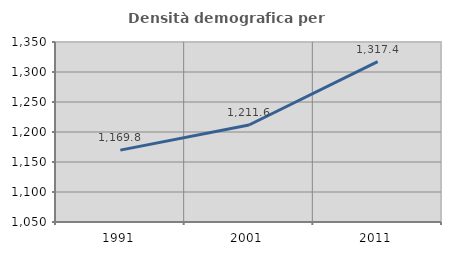
| Category | Densità demografica |
|---|---|
| 1991.0 | 1169.802 |
| 2001.0 | 1211.622 |
| 2011.0 | 1317.395 |